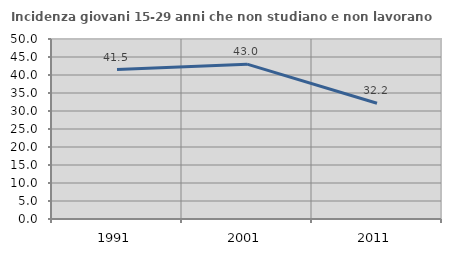
| Category | Incidenza giovani 15-29 anni che non studiano e non lavorano  |
|---|---|
| 1991.0 | 41.527 |
| 2001.0 | 43.011 |
| 2011.0 | 32.155 |